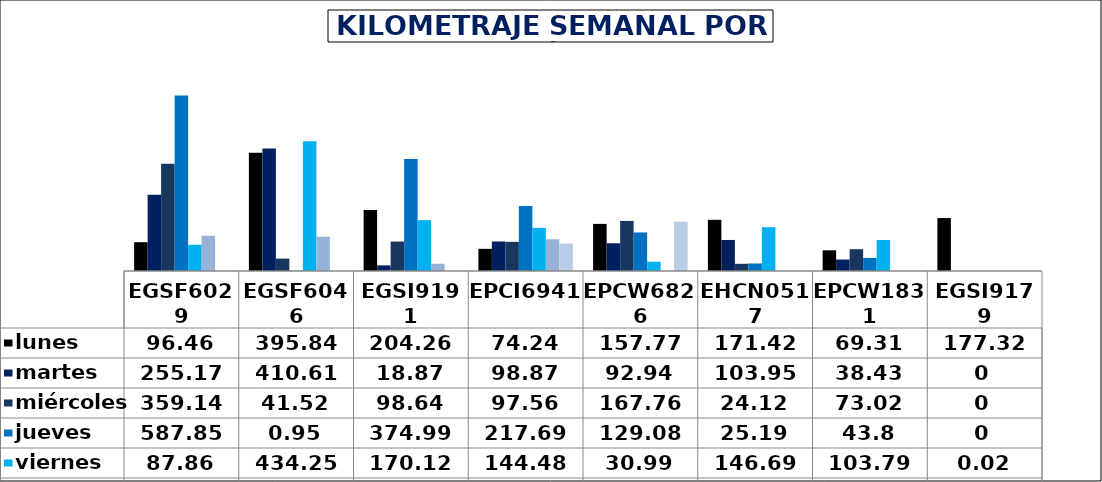
| Category | lunes | martes | miércoles | jueves | viernes | sábado | domingo |
|---|---|---|---|---|---|---|---|
| EGSF6029 | 96.46 | 255.17 | 359.14 | 587.85 | 87.86 | 118.02 | 0 |
| EGSF6046 | 395.84 | 410.61 | 41.52 | 0.95 | 434.25 | 114.77 | 0 |
| EGSI9191 | 204.26 | 18.87 | 98.64 | 374.99 | 170.12 | 24.28 | 0 |
| EPCI6941 | 74.24 | 98.87 | 97.56 | 217.69 | 144.48 | 106.18 | 92.06 |
| EPCW6826 | 157.77 | 92.94 | 167.76 | 129.08 | 30.99 | 0 | 165.08 |
| EHCN0517 | 171.42 | 103.95 | 24.12 | 25.19 | 146.69 | 0 | 0 |
| EPCW1831 | 69.31 | 38.43 | 73.02 | 43.8 | 103.79 | 0 | 0 |
| EGSI9179 | 177.32 | 0 | 0 | 0 | 0.02 | 0 | 0 |